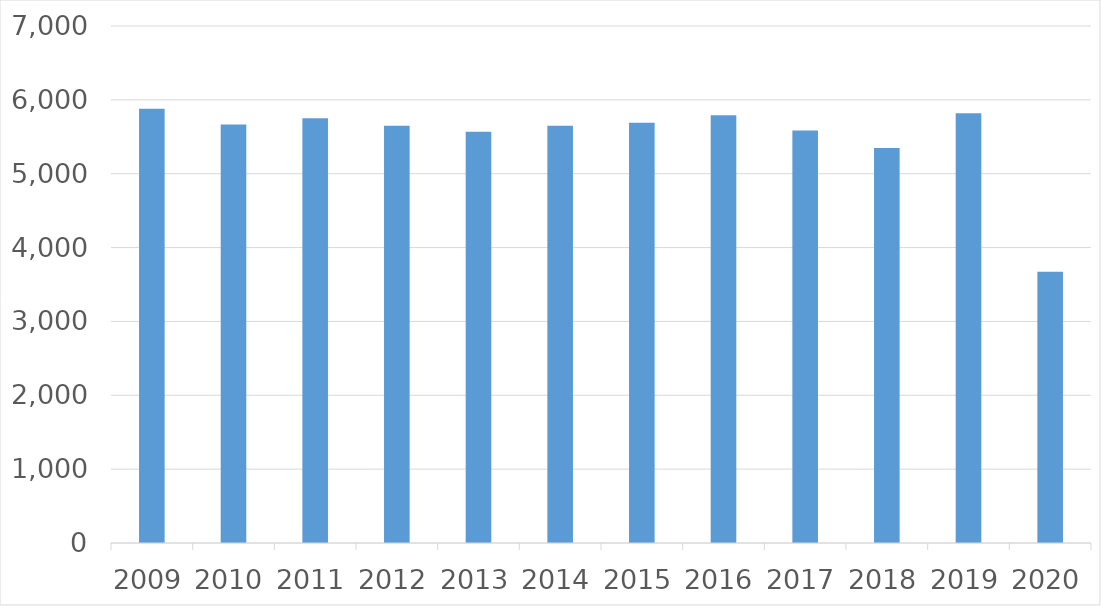
| Category | Series 0 |
|---|---|
| 2009 | 5880 |
| 2010 | 5667 |
| 2011 | 5752 |
| 2012 | 5650 |
| 2013 | 5569 |
| 2014 | 5651 |
| 2015 | 5689 |
| 2016 | 5792 |
| 2017 | 5584 |
| 2018 | 5349 |
| 2019 | 5819 |
| 2020 | 3671 |